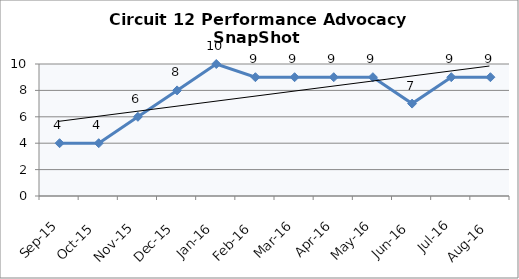
| Category | Circuit 12 |
|---|---|
| Sep-15 | 4 |
| Oct-15 | 4 |
| Nov-15 | 6 |
| Dec-15 | 8 |
| Jan-16 | 10 |
| Feb-16 | 9 |
| Mar-16 | 9 |
| Apr-16 | 9 |
| May-16 | 9 |
| Jun-16 | 7 |
| Jul-16 | 9 |
| Aug-16 | 9 |